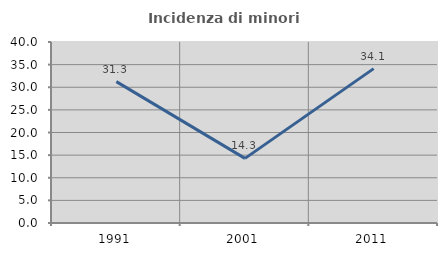
| Category | Incidenza di minori stranieri |
|---|---|
| 1991.0 | 31.25 |
| 2001.0 | 14.286 |
| 2011.0 | 34.118 |